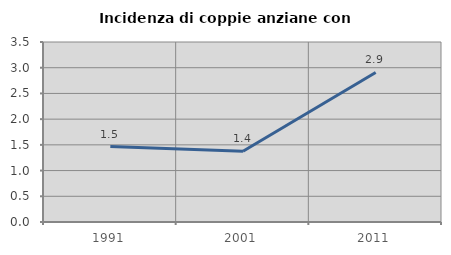
| Category | Incidenza di coppie anziane con figli |
|---|---|
| 1991.0 | 1.466 |
| 2001.0 | 1.375 |
| 2011.0 | 2.908 |